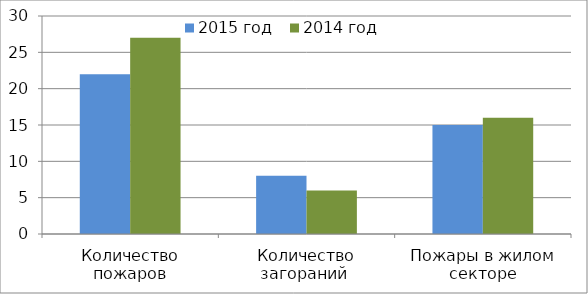
| Category | 2015 год | 2014 год |
|---|---|---|
| Количество пожаров | 22 | 27 |
| Количество загораний  | 8 | 6 |
| Пожары в жилом секторе | 15 | 16 |